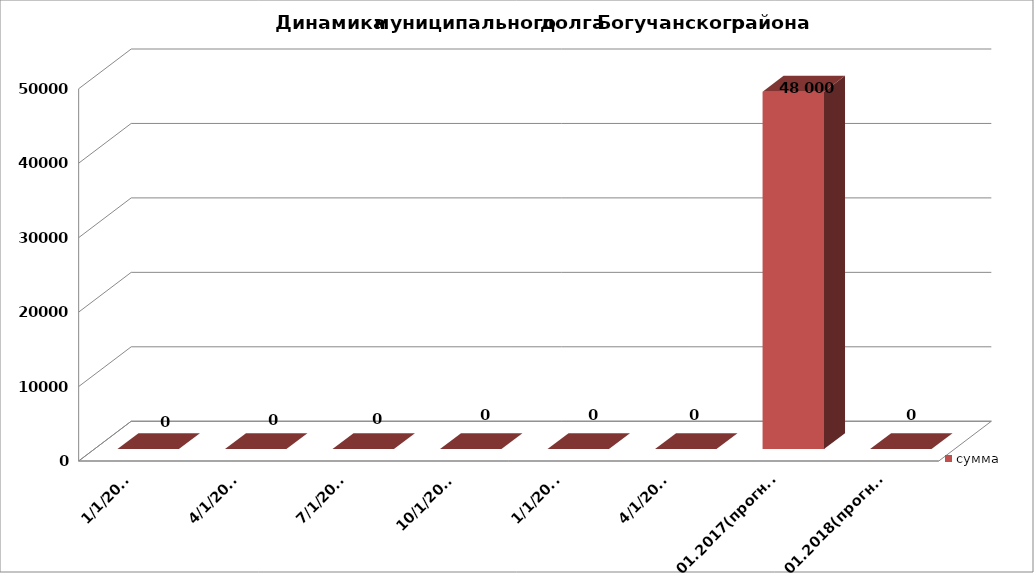
| Category | сумма |
|---|---|
| 01.01.2015 | 0 |
| 01.04.2015 | 0 |
| 01.07.2015 | 0 |
| 01.10.2015 | 0 |
| 01.01.2016 | 0 |
| 01.04.2016 | 0 |
| 01.01.2017(прогноз) | 48000 |
| 01.01.2018(прогноз) | 0 |